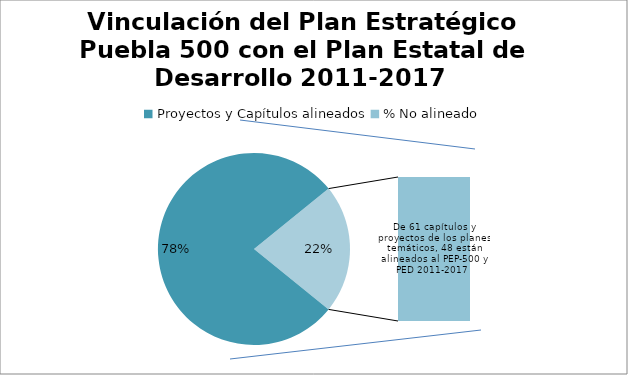
| Category | Vinculación del Plan Estatal de Desarrollo 2011-2017 y el  Plan Estratégico Puebla 500 |
|---|---|
| Proyectos y Capítulos alineados | 47 |
| % No alineado | 13 |